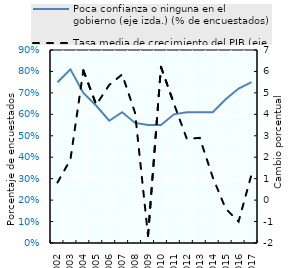
| Category | Poca confianza o ninguna en el gobierno (eje izda.) (% de encuestados) |
|---|---|
| 2002.0 | 0.75 |
| 2003.0 | 0.81 |
| 2004.0 | 0.7 |
| 2005.0 | 0.64 |
| 2006.0 | 0.57 |
| 2007.0 | 0.61 |
| 2008.0 | 0.56 |
| 2009.0 | 0.55 |
| 2010.0 | 0.55 |
| 2011.0 | 0.6 |
| 2012.0 | 0.61 |
| 2013.0 | 0.61 |
| 2014.0 | 0.61 |
| 2015.0 | 0.67 |
| 2016.0 | 0.72 |
| 2017.0 | 0.75 |